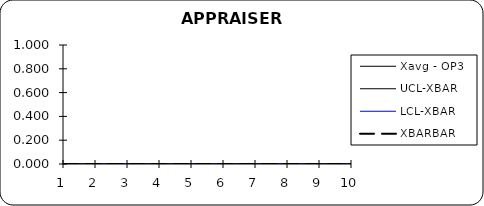
| Category | Xavg - OP3 | UCL-XBAR | LCL-XBAR | XBARBAR |
|---|---|---|---|---|
| 0 | 0 | 0 | 0 | 0 |
| 1 | 0 | 0 | 0 | 0 |
| 2 | 0 | 0 | 0 | 0 |
| 3 | 0 | 0 | 0 | 0 |
| 4 | 0 | 0 | 0 | 0 |
| 5 | 0 | 0 | 0 | 0 |
| 6 | 0 | 0 | 0 | 0 |
| 7 | 0 | 0 | 0 | 0 |
| 8 | 0 | 0 | 0 | 0 |
| 9 | 0 | 0 | 0 | 0 |